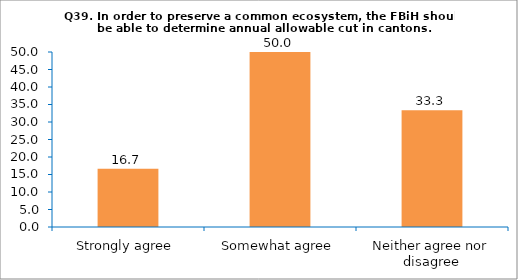
| Category | Series 0 |
|---|---|
| Strongly agree | 16.667 |
| Somewhat agree | 50 |
| Neither agree nor disagree | 33.333 |